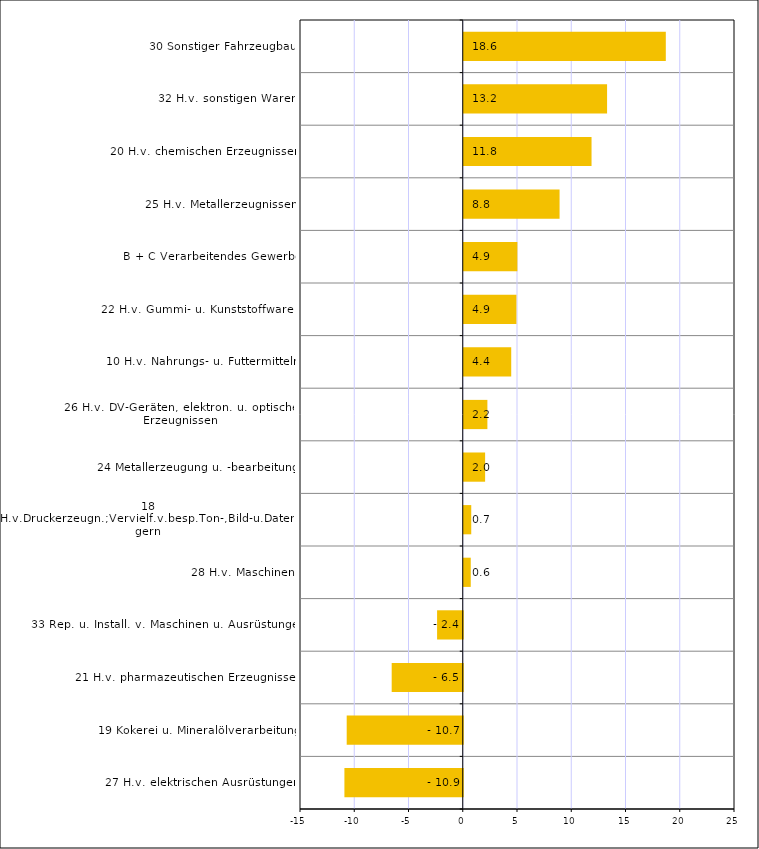
| Category | Series 0 |
|---|---|
| 27 H.v. elektrischen Ausrüstungen | -10.907 |
| 19 Kokerei u. Mineralölverarbeitung | -10.696 |
| 21 H.v. pharmazeutischen Erzeugnissen | -6.549 |
| 33 Rep. u. Install. v. Maschinen u. Ausrüstungen | -2.365 |
| 28 H.v. Maschinen | 0.646 |
| 18 H.v.Druckerzeugn.;Vervielf.v.besp.Ton-,Bild-u.Datenträgern | 0.691 |
| 24 Metallerzeugung u. -bearbeitung | 1.969 |
| 26 H.v. DV-Geräten, elektron. u. optischen Erzeugnissen | 2.179 |
| 10 H.v. Nahrungs- u. Futtermitteln | 4.375 |
| 22 H.v. Gummi- u. Kunststoffwaren | 4.852 |
| B + C Verarbeitendes Gewerbe | 4.943 |
| 25 H.v. Metallerzeugnissen | 8.831 |
| 20 H.v. chemischen Erzeugnissen | 11.778 |
| 32 H.v. sonstigen Waren | 13.21 |
| 30 Sonstiger Fahrzeugbau | 18.623 |